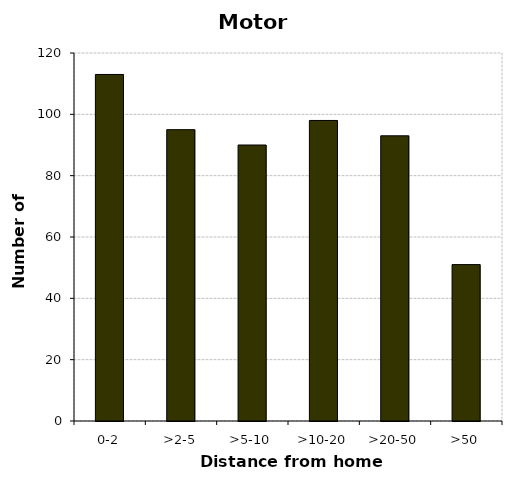
| Category | Motorcycles |
|---|---|
| 0-2 | 113 |
| >2-5 | 95 |
| >5-10 | 90 |
| >10-20 | 98 |
| >20-50 | 93 |
| >50 | 51 |